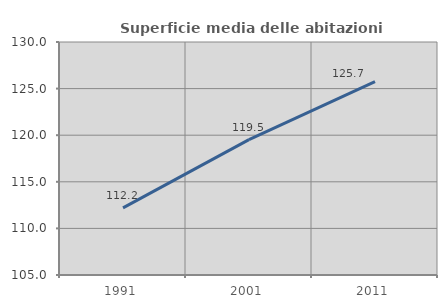
| Category | Superficie media delle abitazioni occupate |
|---|---|
| 1991.0 | 112.203 |
| 2001.0 | 119.521 |
| 2011.0 | 125.74 |